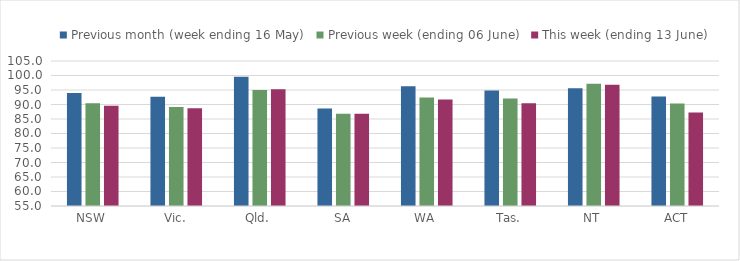
| Category | Previous month (week ending 16 May) | Previous week (ending 06 June) | This week (ending 13 June) |
|---|---|---|---|
| NSW | 94.003 | 90.429 | 89.611 |
| Vic. | 92.677 | 89.121 | 88.673 |
| Qld. | 99.562 | 95.029 | 95.231 |
| SA | 88.654 | 86.795 | 86.78 |
| WA | 96.319 | 92.371 | 91.691 |
| Tas. | 94.844 | 92.105 | 90.464 |
| NT | 95.603 | 97.182 | 96.825 |
| ACT | 92.754 | 90.338 | 87.217 |